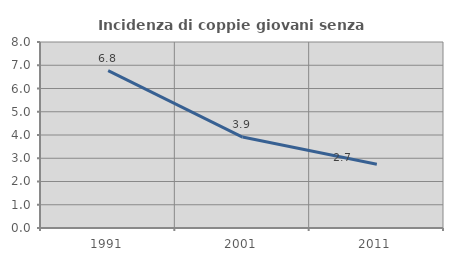
| Category | Incidenza di coppie giovani senza figli |
|---|---|
| 1991.0 | 6.767 |
| 2001.0 | 3.912 |
| 2011.0 | 2.746 |